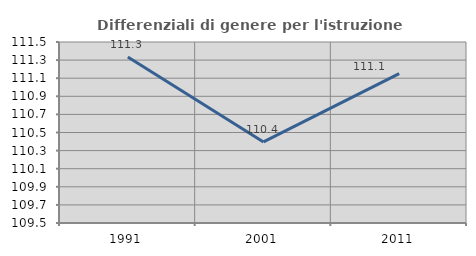
| Category | Differenziali di genere per l'istruzione superiore |
|---|---|
| 1991.0 | 111.335 |
| 2001.0 | 110.396 |
| 2011.0 | 111.15 |